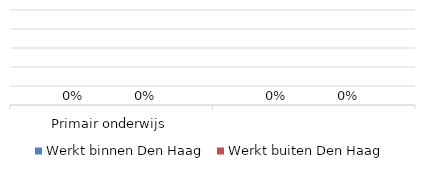
| Category | Werkt binnen Den Haag | Werkt buiten Den Haag |
|---|---|---|
| Primair onderwijs | 0.77 | 0.23 |
| Voortgezet onderwijs | 0.514 | 0.486 |